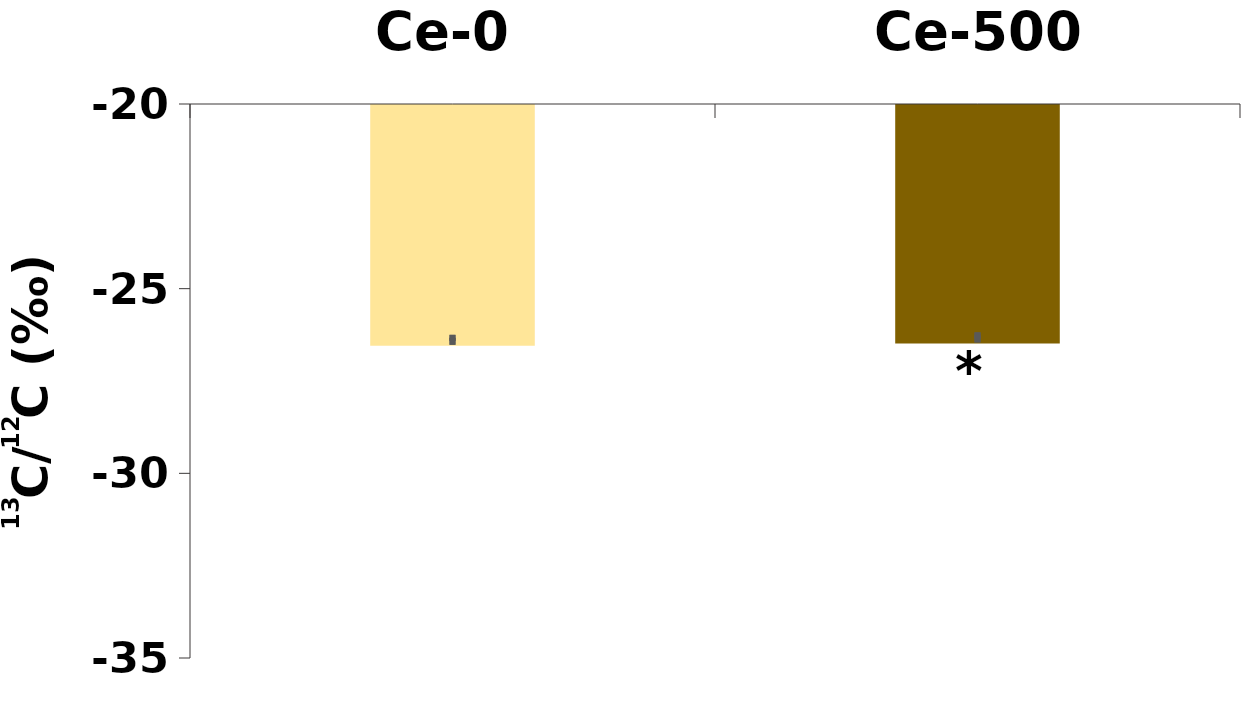
| Category | δ13C |
|---|---|
| Ce-0 | -26.52 |
| Ce-500 | -26.456 |